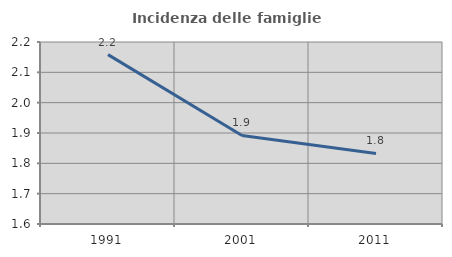
| Category | Incidenza delle famiglie numerose |
|---|---|
| 1991.0 | 2.158 |
| 2001.0 | 1.892 |
| 2011.0 | 1.832 |